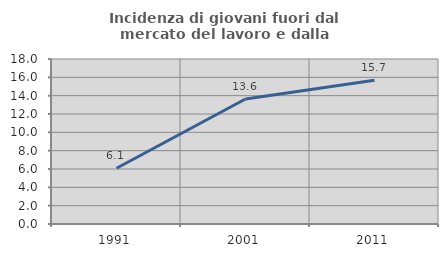
| Category | Incidenza di giovani fuori dal mercato del lavoro e dalla formazione  |
|---|---|
| 1991.0 | 6.087 |
| 2001.0 | 13.636 |
| 2011.0 | 15.686 |